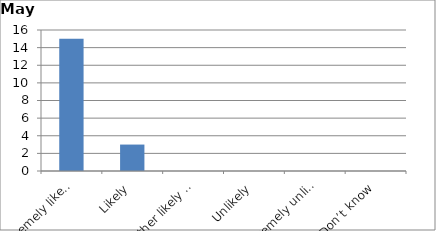
| Category | Series 0 |
|---|---|
| Extremely likely | 15 |
| Likely | 3 |
| Neither likely nor unlikely | 0 |
| Unlikely | 0 |
| Extremely unlikely | 0 |
| Don’t know | 0 |